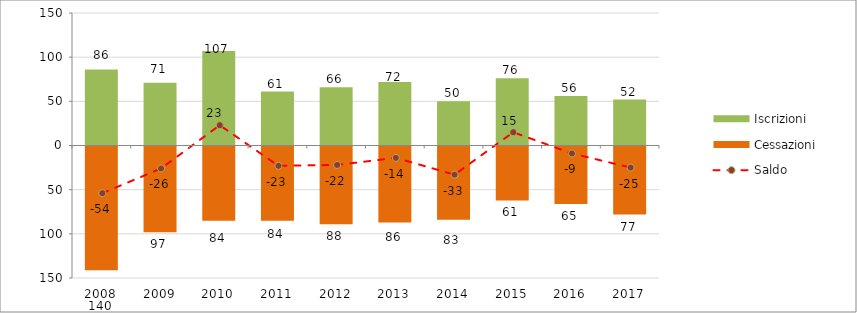
| Category | Iscrizioni | Cessazioni |
|---|---|---|
| 2008.0 | 86 | -140 |
| 2009.0 | 71 | -97 |
| 2010.0 | 107 | -84 |
| 2011.0 | 61 | -84 |
| 2012.0 | 66 | -88 |
| 2013.0 | 72 | -86 |
| 2014.0 | 50 | -83 |
| 2015.0 | 76 | -61 |
| 2016.0 | 56 | -65 |
| 2017.0 | 52 | -77 |